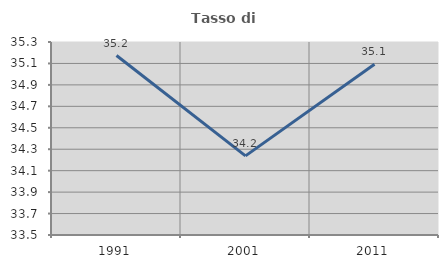
| Category | Tasso di occupazione   |
|---|---|
| 1991.0 | 35.174 |
| 2001.0 | 34.238 |
| 2011.0 | 35.093 |